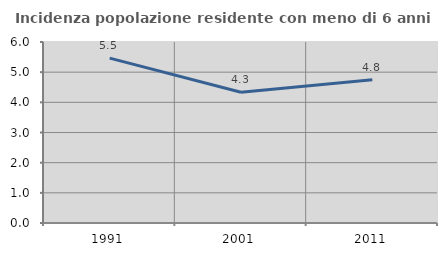
| Category | Incidenza popolazione residente con meno di 6 anni |
|---|---|
| 1991.0 | 5.464 |
| 2001.0 | 4.334 |
| 2011.0 | 4.752 |